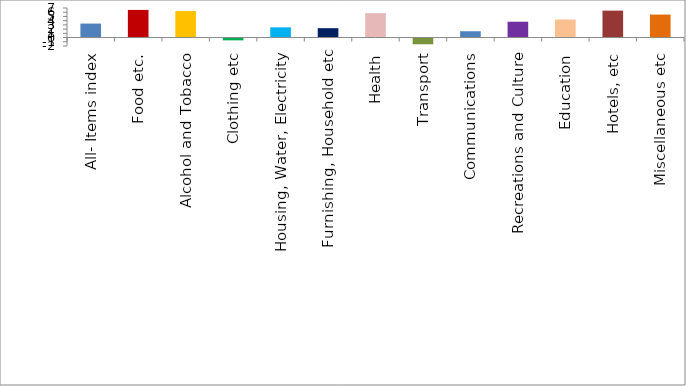
| Category | Series 0 |
|---|---|
| All- Items index | 3.312 |
| Food etc. | 6.547 |
| Alcohol and Tobacco | 6.272 |
| Clothing etc | -0.662 |
| Housing, Water, Electricity | 2.417 |
| Furnishing, Household etc | 2.219 |
| Health | 5.785 |
| Transport | -1.588 |
| Communications | 1.495 |
| Recreations and Culture | 3.75 |
| Education | 4.273 |
| Hotels, etc | 6.377 |
| Miscellaneous etc | 5.444 |